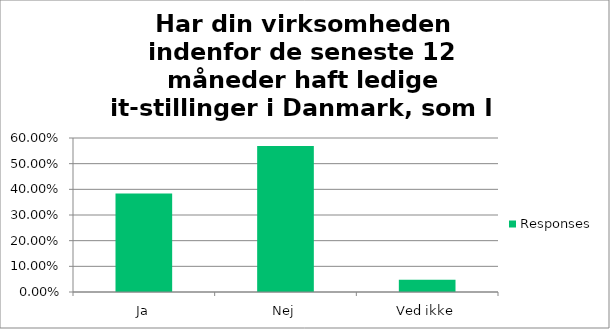
| Category | Responses |
|---|---|
| Ja | 0.384 |
| Nej | 0.569 |
| Ved ikke | 0.047 |